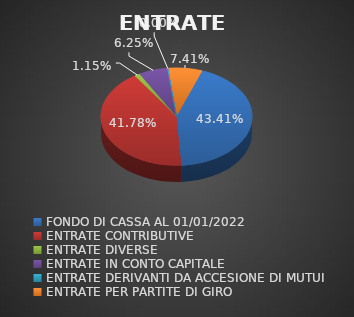
| Category | ENTRATE |
|---|---|
| FONDO DI CASSA AL 01/01/2022 | 0.434 |
| ENTRATE CONTRIBUTIVE | 0.418 |
| ENTRATE DIVERSE | 0.012 |
| ENTRATE IN CONTO CAPITALE | 0.062 |
| ENTRATE DERIVANTI DA ACCESIONE DI MUTUI | 0 |
| ENTRATE PER PARTITE DI GIRO | 0.074 |